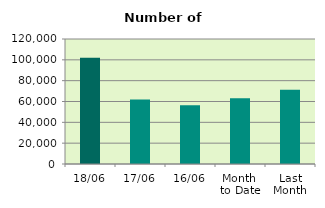
| Category | Series 0 |
|---|---|
| 18/06 | 101898 |
| 17/06 | 61922 |
| 16/06 | 56512 |
| Month 
to Date | 63047.857 |
| Last
Month | 71249.7 |